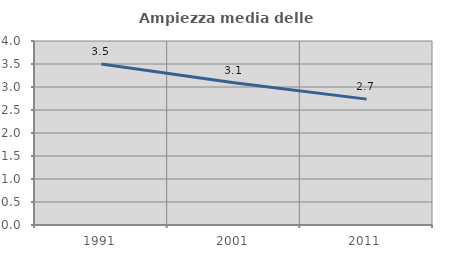
| Category | Ampiezza media delle famiglie |
|---|---|
| 1991.0 | 3.498 |
| 2001.0 | 3.091 |
| 2011.0 | 2.736 |